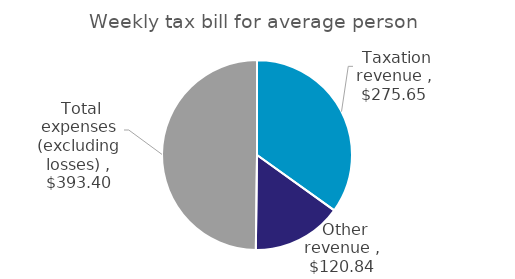
| Category | Series 0 |
|---|---|
|  Taxation revenue  | 275.648 |
|  Other revenue  | 120.842 |
|  Total expenses (excluding losses)  | 393.397 |